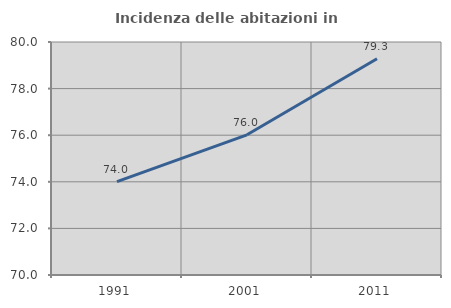
| Category | Incidenza delle abitazioni in proprietà  |
|---|---|
| 1991.0 | 74.009 |
| 2001.0 | 76.018 |
| 2011.0 | 79.279 |